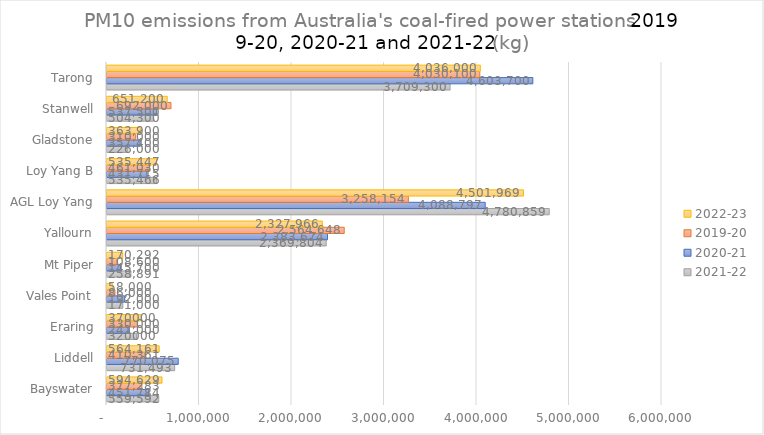
| Category | 2021-22 | 2020-21 | 2019-20 | 2022-23 |
|---|---|---|---|---|
| Bayswater | 559592.4 | 451784 | 377282.6 | 594629.1 |
| Liddell | 731492.6 | 770075.2 | 410360.6 | 564160.5 |
|  Eraring  | 320000 | 241000 | 330000 | 370000 |
| Vales Point | 171000 | 192000 | 86000 | 58000 |
| Mt Piper | 258891.11 | 145700 | 108600 | 170292 |
| Yallourn | 2369804 | 2383674 | 2564648 | 2327966.13 |
| AGL Loy Yang | 4780859 | 4088797 | 3258154 | 4501969 |
|  Loy Yang B  | 535466 | 431715 | 461030 | 535447 |
| Gladstone | 226000 | 357400 | 310000 | 363900 |
| Stanwell | 504300 | 537500 | 692000 | 651200 |
| Tarong | 3709300 | 4603700 | 4030100 | 4036000 |